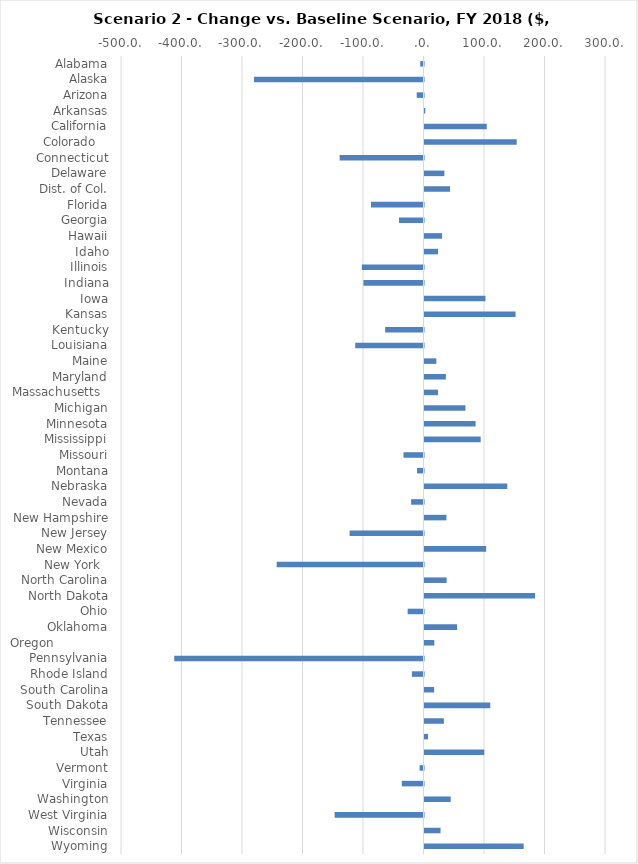
| Category | #REF! |
|---|---|
| Alabama | -5384043.948 |
| Alaska | -280104439.571 |
| Arizona | -11237534.003 |
| Arkansas | 1268849.969 |
| California | 102877196.974 |
| Colorado    | 152433791.533 |
| Connecticut | -138573194.698 |
| Delaware | 32856081.234 |
| Dist. of Col. | 42255841.684 |
| Florida | -86780161.615 |
| Georgia | -40474427.775 |
| Hawaii | 29070643.375 |
| Idaho | 22307380.758 |
| Illinois | -101902404.265 |
| Indiana | -99319835.463 |
| Iowa | 100721300.516 |
| Kansas | 150523870.655 |
| Kentucky | -63381811.567 |
| Louisiana | -112899626.505 |
| Maine | 19520047.937 |
| Maryland | 35368246.565 |
| Massachusetts   | 22288710.955 |
| Michigan | 67697433.002 |
| Minnesota | 84386934.082 |
| Mississippi | 92839408.214 |
| Missouri | -33077881.02 |
| Montana | -10689350.421 |
| Nebraska | 136836593.076 |
| Nevada | -20456718.893 |
| New Hampshire | 36254267.49 |
| New Jersey | -122120940.277 |
| New Mexico | 101897756.799 |
| New York   | -242684227.314 |
| North Carolina | 36580097.203 |
| North Dakota | 182775320.454 |
| Ohio | -26176562.455 |
| Oklahoma | 53817803.212 |
| Oregon               | 16194891.579 |
| Pennsylvania | -412002640.481 |
| Rhode Island | -19174117.163 |
| South Carolina | 15905538.155 |
| South Dakota | 108717831.735 |
| Tennessee | 32027801.544 |
| Texas | 5752427.078 |
| Utah | 98769068.645 |
| Vermont | -6528929.625 |
| Virginia | -35784714.145 |
| Washington | 43301690.897 |
| West Virginia | -146909407.352 |
| Wisconsin | 26510763.038 |
| Wyoming | 163905380.2 |